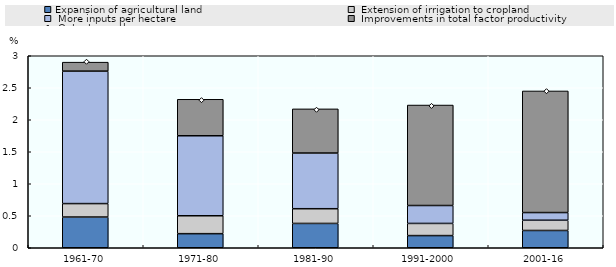
| Category | Expansion of agricultural land |  Extension of irrigation to cropland |  More inputs per hectare |  Improvements in total factor productivity |
|---|---|---|---|---|
| 1961-70 | 0.48 | 0.21 | 2.07 | 0.14 |
| 1971-80 | 0.22 | 0.28 | 1.25 | 0.57 |
| 1981-90 | 0.38 | 0.23 | 0.87 | 0.69 |
| 1991-2000 | 0.19 | 0.19 | 0.28 | 1.57 |
| 2001-16 | 0.27 | 0.16 | 0.12 | 1.9 |